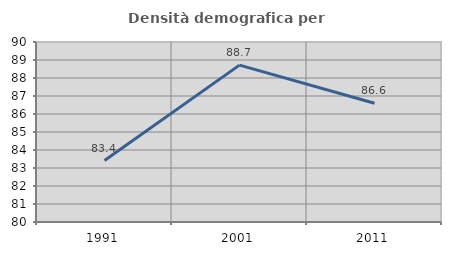
| Category | Densità demografica |
|---|---|
| 1991.0 | 83.414 |
| 2001.0 | 88.716 |
| 2011.0 | 86.595 |